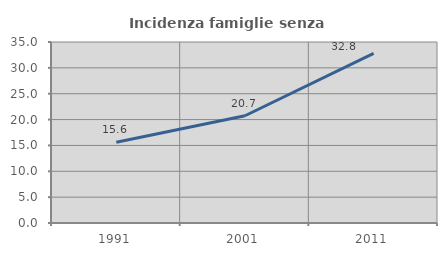
| Category | Incidenza famiglie senza nuclei |
|---|---|
| 1991.0 | 15.611 |
| 2001.0 | 20.739 |
| 2011.0 | 32.802 |